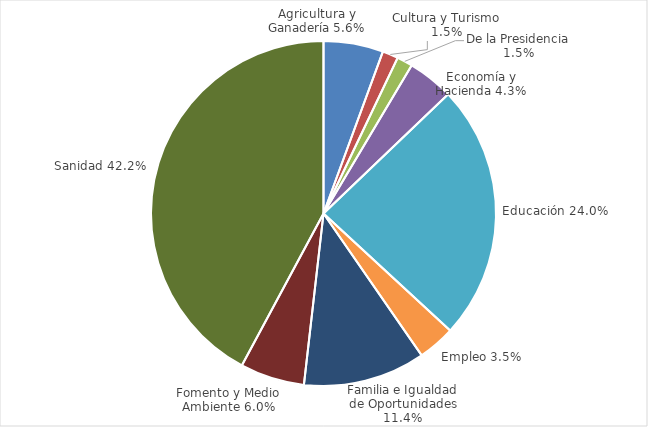
| Category | Series 0 |
|---|---|
| Agricultura y Ganadería | 0.056 |
| Cultura y Turismo | 0.015 |
| De la Presidencia | 0.015 |
| Economía y Hacienda | 0.043 |
| Educación | 0.24 |
| Empleo | 0.035 |
| Familia e Igualdad de Oportunidades | 0.114 |
| Fomento y Medio Ambiente | 0.06 |
| Sanidad | 0.422 |